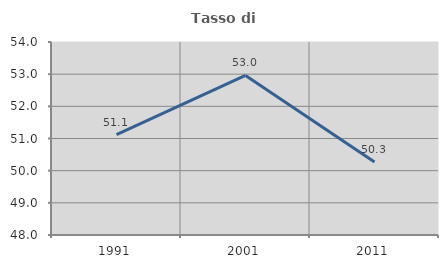
| Category | Tasso di occupazione   |
|---|---|
| 1991.0 | 51.12 |
| 2001.0 | 52.96 |
| 2011.0 | 50.266 |